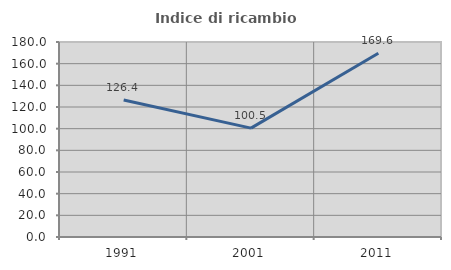
| Category | Indice di ricambio occupazionale  |
|---|---|
| 1991.0 | 126.403 |
| 2001.0 | 100.495 |
| 2011.0 | 169.62 |